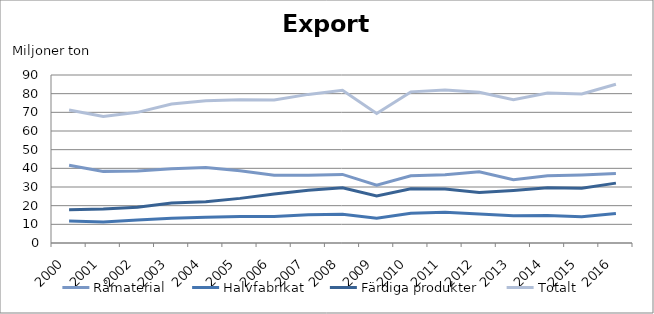
| Category | Råmaterial | Halvfabrikat | Färdiga produkter | Totalt |
|---|---|---|---|---|
| 2000.0 | 41.688 | 11.758 | 17.752 | 71.198 |
| 2001.0 | 38.371 | 11.277 | 18.182 | 67.83 |
| 2002.0 | 38.577 | 12.277 | 19.143 | 69.998 |
| 2003.0 | 39.734 | 13.273 | 21.444 | 74.451 |
| 2004.0 | 40.405 | 13.753 | 22.066 | 76.225 |
| 2005.0 | 38.684 | 14.132 | 23.906 | 76.722 |
| 2006.0 | 36.256 | 14.162 | 26.212 | 76.629 |
| 2007.0 | 36.27 | 15.078 | 28.265 | 79.613 |
| 2008.0 | 36.749 | 15.423 | 29.631 | 81.803 |
| 2009.0 | 30.949 | 13.254 | 25.211 | 69.414 |
| 2010.0 | 36.017 | 15.931 | 29.011 | 80.96 |
| 2011.0 | 36.516 | 16.464 | 28.968 | 81.948 |
| 2012.0 | 38.104 | 15.532 | 27.102 | 80.737 |
| 2013.0 | 33.918 | 14.615 | 28.185 | 76.719 |
| 2014.0 | 35.964 | 14.786 | 29.615 | 80.364 |
| 2015.0 | 36.447 | 14.052 | 29.373 | 79.871 |
| 2016.0 | 37.172 | 15.832 | 32.07 | 85.074 |